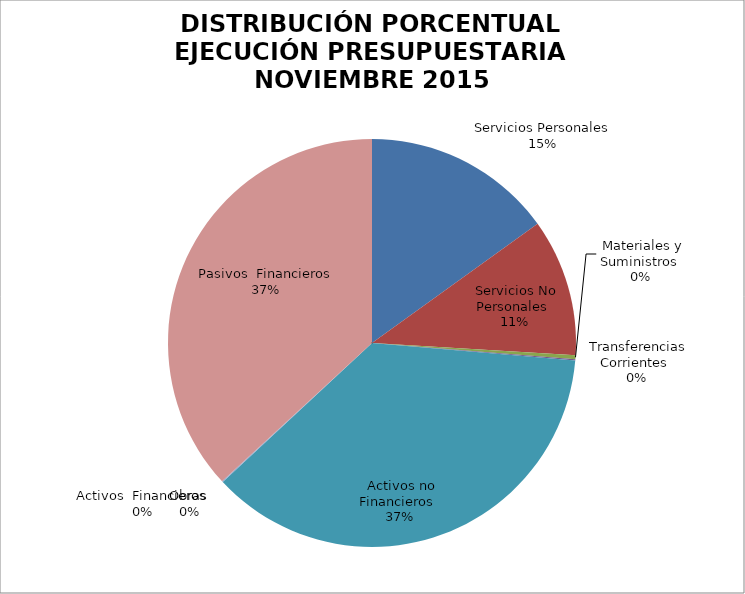
| Category | Series 0 | Series 1 |
|---|---|---|
| Servicios Personales | 11009265.69 | 0.574 |
| Servicios No Personales | 7948476.4 | 0.414 |
| Materiales y Suministros | 234109.04 | 0.012 |
| Transferencias Corrientes | 64000 | 0.001 |
| Activos no Financieros | 26807026.14 | 1.397 |
| Obras | 0 | 0 |
| Activos  Financieros | 55503.83 | 0.003 |
| Pasivos  Financieros | -26924235.15 | -1.403 |